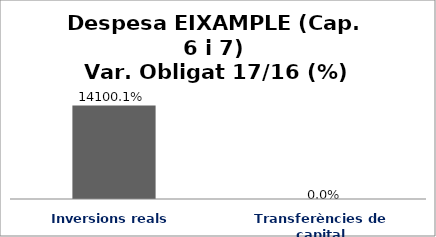
| Category | Series 0 |
|---|---|
| Inversions reals | 141.001 |
| Transferències de capital | 0 |